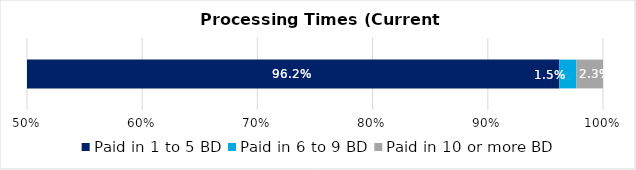
| Category | Paid in 1 to 5 BD | Paid in 6 to 9 BD | Paid in 10 or more BD |
|---|---|---|---|
| 0 | 0.962 | 0.015 | 0.023 |